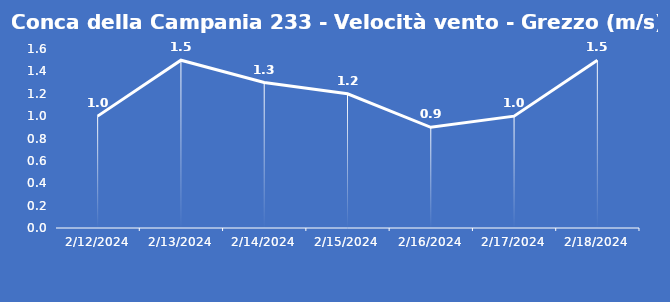
| Category | Conca della Campania 233 - Velocità vento - Grezzo (m/s) |
|---|---|
| 2/12/24 | 1 |
| 2/13/24 | 1.5 |
| 2/14/24 | 1.3 |
| 2/15/24 | 1.2 |
| 2/16/24 | 0.9 |
| 2/17/24 | 1 |
| 2/18/24 | 1.5 |